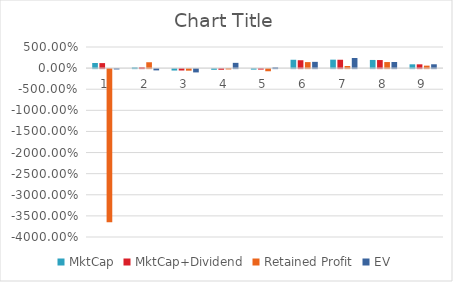
| Category | MktCap | MktCap+Dividend | Retained Profit | EV |
|---|---|---|---|---|
| 0 | 1.214 | 1.186 | -36.265 | -0.079 |
| 1 | 0.155 | 0.175 | 1.389 | -0.301 |
| 2 | -0.338 | -0.329 | -0.369 | -0.783 |
| 3 | -0.161 | -0.155 | -0.076 | 1.248 |
| 4 | -0.119 | -0.113 | -0.508 | 0.163 |
| 5 | 1.976 | 1.868 | 1.423 | 1.483 |
| 6 | 2 | 1.981 | 0.506 | 2.389 |
| 7 | 1.933 | 1.912 | 1.437 | 1.445 |
| 8 | 0.899 | 0.895 | 0.587 | 0.908 |